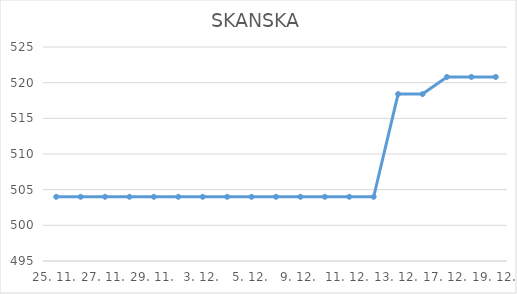
| Category | SKANSKA |
|---|---|
| 25. 11. | 504 |
| 26. 11. | 504 |
| 27. 11. | 504 |
| 28. 11. | 504 |
| 29. 11. | 504 |
| 2. 12. | 504 |
| 3. 12. | 504 |
| 4. 12. | 504 |
| 5. 12. | 504 |
| 6. 12. | 504 |
| 9. 12. | 504 |
| 10. 12. | 504 |
| 11. 12. | 504 |
| 12. 12. | 504 |
| 13. 12. | 518.4 |
| 16. 12. | 518.4 |
| 17. 12. | 520.8 |
| 18. 12. | 520.8 |
| 19. 12. | 520.8 |